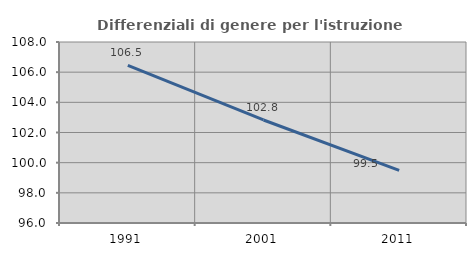
| Category | Differenziali di genere per l'istruzione superiore |
|---|---|
| 1991.0 | 106.452 |
| 2001.0 | 102.83 |
| 2011.0 | 99.492 |